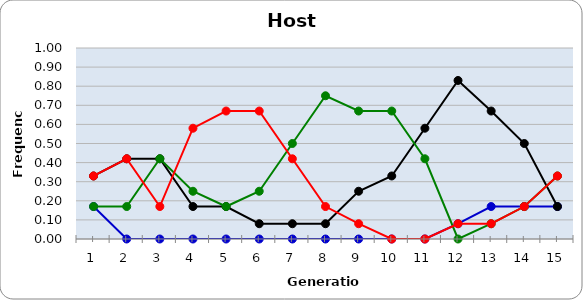
| Category | Sp | Cl | Di | He |
|---|---|---|---|---|
| 1.0 | 0.17 | 0.33 | 0.17 | 0.33 |
| 2.0 | 0 | 0.42 | 0.17 | 0.42 |
| 3.0 | 0 | 0.42 | 0.42 | 0.17 |
| 4.0 | 0 | 0.17 | 0.25 | 0.58 |
| 5.0 | 0 | 0.17 | 0.17 | 0.67 |
| 6.0 | 0 | 0.08 | 0.25 | 0.67 |
| 7.0 | 0 | 0.08 | 0.5 | 0.42 |
| 8.0 | 0 | 0.08 | 0.75 | 0.17 |
| 9.0 | 0 | 0.25 | 0.67 | 0.08 |
| 10.0 | 0 | 0.33 | 0.67 | 0 |
| 11.0 | 0 | 0.58 | 0.42 | 0 |
| 12.0 | 0.08 | 0.83 | 0 | 0.08 |
| 13.0 | 0.17 | 0.67 | 0.08 | 0.08 |
| 14.0 | 0.17 | 0.5 | 0.17 | 0.17 |
| 15.0 | 0.17 | 0.17 | 0.33 | 0.33 |